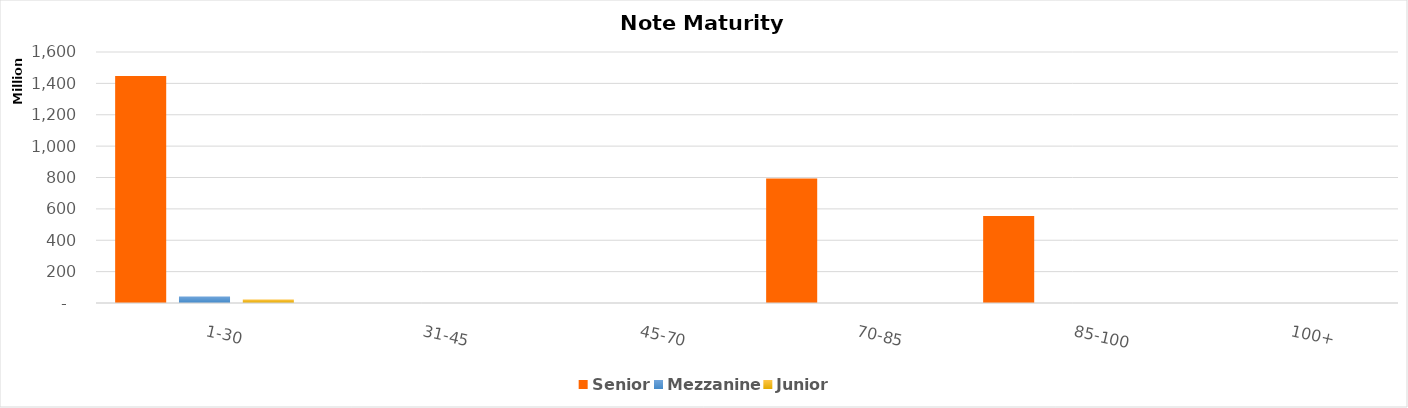
| Category | Senior | Mezzanine | Junior |
|---|---|---|---|
| 1-30 | 1446800000 | 42000000 | 23000000 |
| 31-45 | 0 | 0 | 0 |
| 45-70 | 0 | 0 | 0 |
| 70-85 | 794200000 | 0 | 0 |
| 85-100 | 554000000 | 0 | 0 |
| 100+ | 0 | 0 | 0 |